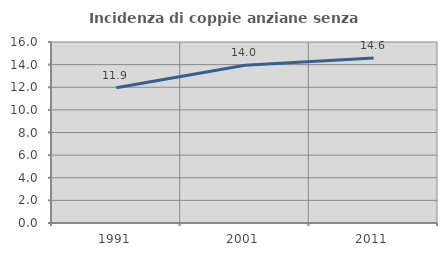
| Category | Incidenza di coppie anziane senza figli  |
|---|---|
| 1991.0 | 11.948 |
| 2001.0 | 13.952 |
| 2011.0 | 14.586 |